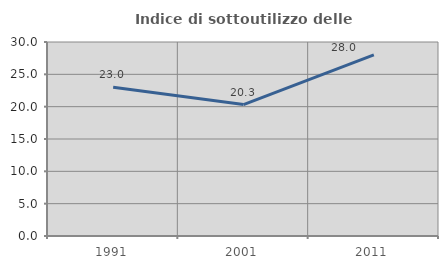
| Category | Indice di sottoutilizzo delle abitazioni  |
|---|---|
| 1991.0 | 22.989 |
| 2001.0 | 20.33 |
| 2011.0 | 28 |